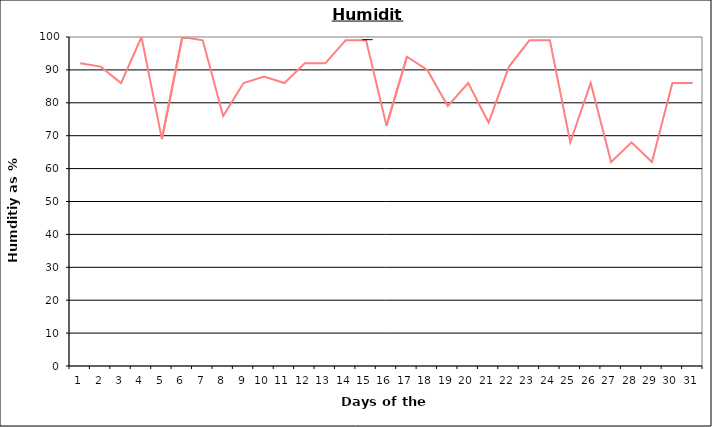
| Category | Series 0 |
|---|---|
| 0 | 92 |
| 1 | 91 |
| 2 | 86 |
| 3 | 100 |
| 4 | 69 |
| 5 | 100 |
| 6 | 99 |
| 7 | 76 |
| 8 | 86 |
| 9 | 88 |
| 10 | 86 |
| 11 | 92 |
| 12 | 92 |
| 13 | 99 |
| 14 | 99 |
| 15 | 73 |
| 16 | 94 |
| 17 | 90 |
| 18 | 79 |
| 19 | 86 |
| 20 | 74 |
| 21 | 91 |
| 22 | 99 |
| 23 | 99 |
| 24 | 68 |
| 25 | 86 |
| 26 | 62 |
| 27 | 68 |
| 28 | 62 |
| 29 | 86 |
| 30 | 86 |